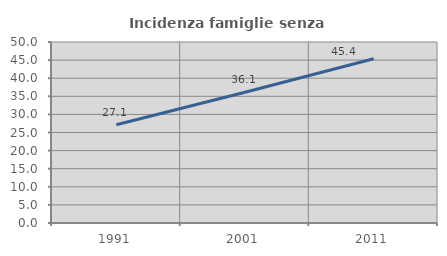
| Category | Incidenza famiglie senza nuclei |
|---|---|
| 1991.0 | 27.132 |
| 2001.0 | 36.111 |
| 2011.0 | 45.391 |